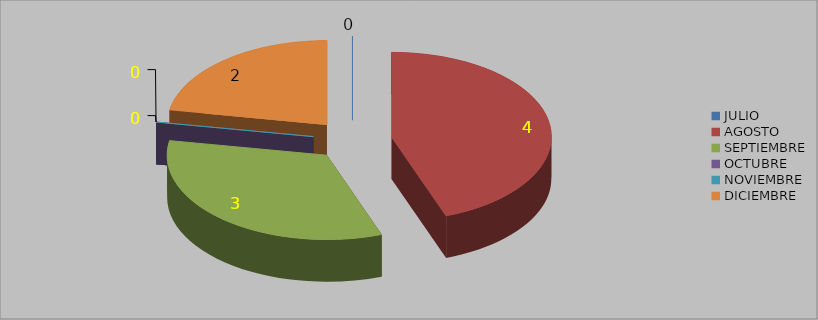
| Category | RECURSOS DE REVISIÓN SEGUNDO SEMESTRE 2014 |
|---|---|
| JULIO | 0 |
| AGOSTO | 4 |
| SEPTIEMBRE | 3 |
| OCTUBRE | 0 |
| NOVIEMBRE | 0 |
| DICIEMBRE | 2 |